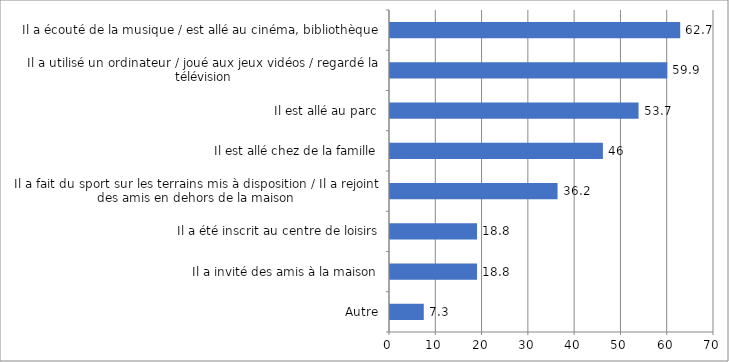
| Category | Series 0 |
|---|---|
| Autre | 7.3 |
| Il a invité des amis à la maison | 18.8 |
| Il a été inscrit au centre de loisirs | 18.8 |
| Il a fait du sport sur les terrains mis à disposition / Il a rejoint des amis en dehors de la maison | 36.2 |
| Il est allé chez de la famille | 46 |
| Il est allé au parc | 53.7 |
| Il a utilisé un ordinateur / joué aux jeux vidéos / regardé la télévision | 59.9 |
| Il a écouté de la musique / est allé au cinéma, bibliothèque | 62.7 |